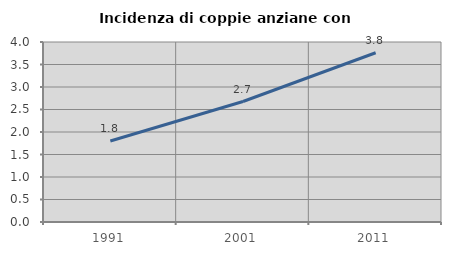
| Category | Incidenza di coppie anziane con figli |
|---|---|
| 1991.0 | 1.801 |
| 2001.0 | 2.677 |
| 2011.0 | 3.761 |